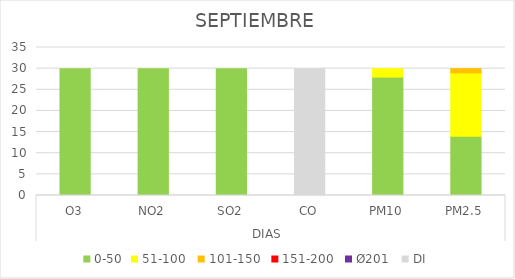
| Category | 0-50 | 51-100  | 101-150  | 151-200  | Ø201  | DI |
|---|---|---|---|---|---|---|
| 0 | 30 | 0 | 0 | 0 | 0 | 0 |
| 1 | 30 | 0 | 0 | 0 | 0 | 0 |
| 2 | 30 | 0 | 0 | 0 | 0 | 0 |
| 3 | 0 | 0 | 0 | 0 | 0 | 30 |
| 4 | 28 | 2 | 0 | 0 | 0 | 0 |
| 5 | 14 | 15 | 1 | 0 | 0 | 0 |